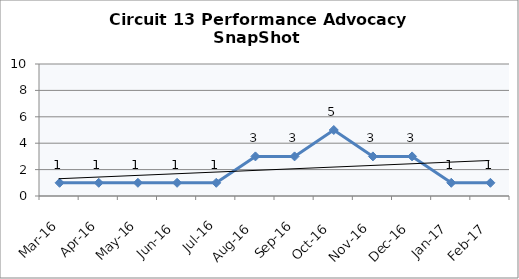
| Category | Circuit 13 |
|---|---|
| Mar-16 | 1 |
| Apr-16 | 1 |
| May-16 | 1 |
| Jun-16 | 1 |
| Jul-16 | 1 |
| Aug-16 | 3 |
| Sep-16 | 3 |
| Oct-16 | 5 |
| Nov-16 | 3 |
| Dec-16 | 3 |
| Jan-17 | 1 |
| Feb-17 | 1 |